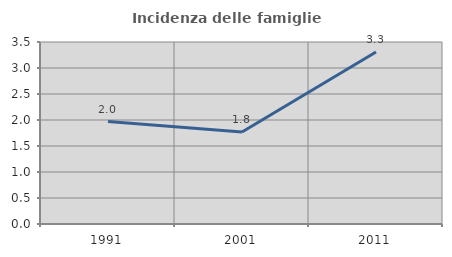
| Category | Incidenza delle famiglie numerose |
|---|---|
| 1991.0 | 1.97 |
| 2001.0 | 1.768 |
| 2011.0 | 3.309 |